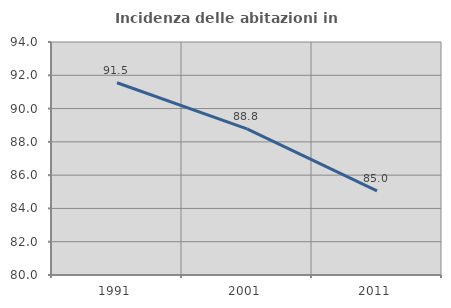
| Category | Incidenza delle abitazioni in proprietà  |
|---|---|
| 1991.0 | 91.549 |
| 2001.0 | 88.781 |
| 2011.0 | 85.049 |